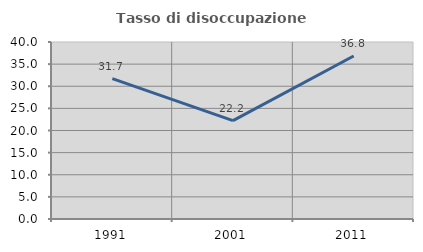
| Category | Tasso di disoccupazione giovanile  |
|---|---|
| 1991.0 | 31.707 |
| 2001.0 | 22.222 |
| 2011.0 | 36.842 |